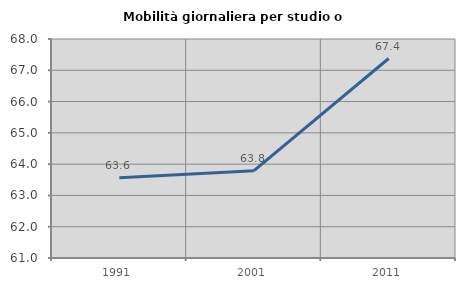
| Category | Mobilità giornaliera per studio o lavoro |
|---|---|
| 1991.0 | 63.567 |
| 2001.0 | 63.791 |
| 2011.0 | 67.377 |